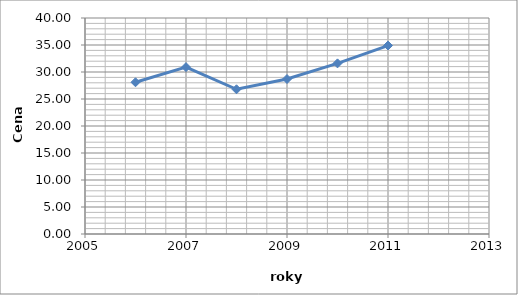
| Category | Cena v Kč |
|---|---|
| 2006.0 | 28.1 |
| 2007.0 | 30.9 |
| 2008.0 | 26.8 |
| 2009.0 | 28.7 |
| 2010.0 | 31.6 |
| 2011.0 | 34.9 |